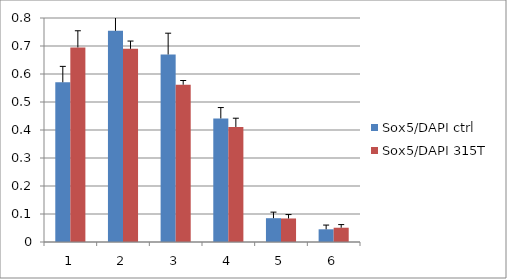
| Category | Sox5/DAPI ctrl | Sox5/DAPI 315T |
|---|---|---|
| 0 | 0.57 | 0.695 |
| 1 | 0.754 | 0.69 |
| 2 | 0.67 | 0.562 |
| 3 | 0.441 | 0.411 |
| 4 | 0.085 | 0.084 |
| 5 | 0.045 | 0.051 |